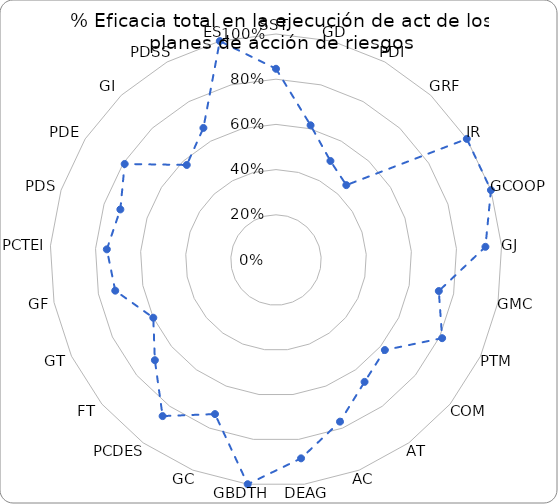
| Category | % Eficacia total |
|---|---|
| SST | 0.846 |
| GD | 0.615 |
| PDI | 0.5 |
| GRF | 0.455 |
| IR | 1 |
| GCOOP | 1 |
| GJ | 0.929 |
| GMC | 0.733 |
| PTM | 0.812 |
| COM | 0.625 |
| AT | 0.667 |
| AC | 0.769 |
| DEAG | 0.885 |
| GBDTH | 1 |
| GC | 0.733 |
| PCDES | 0.854 |
| FT | 0.696 |
| GT | 0.6 |
| GF | 0.724 |
| PCTEI | 0.75 |
| PDS | 0.724 |
| PDE | 0.793 |
| GI | 0.577 |
| PDSS | 0.667 |
| ES | 1 |